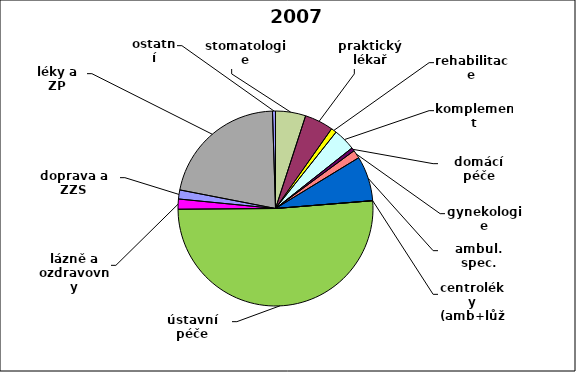
| Category | Series 0 |
|---|---|
| stomatologie | 0.05 |
| praktický lékař | 0.048 |
| rehabilitace | 0.009 |
| komplement | 0.037 |
| domácí péče | 0.006 |
| gynekologie | 0.014 |
| ambul. spec. | 0.074 |
| centroléky (amb+lůž) | 0 |
| ústavní péče | 0.512 |
| lázně a ozdravovny | 0.017 |
| doprava a ZZS | 0.015 |
| léky a ZP | 0.214 |
| ostatní | 0.005 |